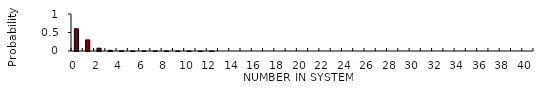
| Category | Series 0 |
|---|---|
| 0.0 | 0.6 |
| 1.0 | 0.3 |
| 2.0 | 0.075 |
| 3.0 | 0.019 |
| 4.0 | 0.005 |
| 5.0 | 0.001 |
| 6.0 | 0 |
| 7.0 | 0 |
| 8.0 | 0 |
| 9.0 | 0 |
| 10.0 | 0 |
| 11.0 | 0 |
| 12.0 | 0 |
| 13.0 | 0 |
| 14.0 | 0 |
| 15.0 | 0 |
| 16.0 | 0 |
| 17.0 | 0 |
| 18.0 | 0 |
| 19.0 | 0 |
| 20.0 | 0 |
| 21.0 | 0 |
| 22.0 | 0 |
| 23.0 | 0 |
| 24.0 | 0 |
| 25.0 | 0 |
| 26.0 | 0 |
| 27.0 | 0 |
| 28.0 | 0 |
| 29.0 | 0 |
| 30.0 | 0 |
| 31.0 | 0 |
| 32.0 | 0 |
| 33.0 | 0 |
| 34.0 | 0 |
| 35.0 | 0 |
| 36.0 | 0 |
| 37.0 | 0 |
| 38.0 | 0 |
| 39.0 | 0 |
| 40.0 | 0 |